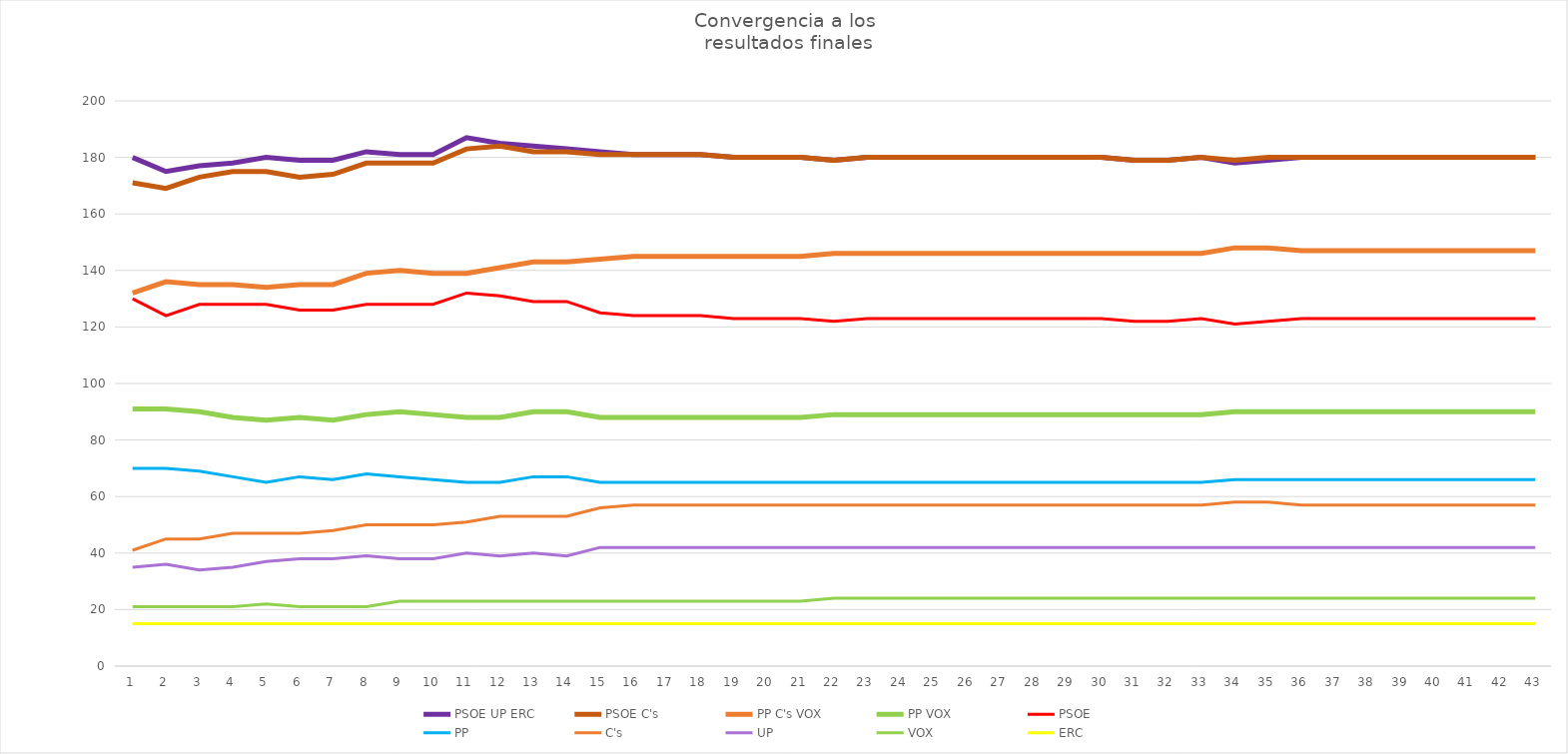
| Category | PSOE | PP | C's | UP | VOX | ERC |
|---|---|---|---|---|---|---|
| 0 | 130 | 70 | 41 | 35 | 21 | 15 |
| 1 | 124 | 70 | 45 | 36 | 21 | 15 |
| 2 | 128 | 69 | 45 | 34 | 21 | 15 |
| 3 | 128 | 67 | 47 | 35 | 21 | 15 |
| 4 | 128 | 65 | 47 | 37 | 22 | 15 |
| 5 | 126 | 67 | 47 | 38 | 21 | 15 |
| 6 | 126 | 66 | 48 | 38 | 21 | 15 |
| 7 | 128 | 68 | 50 | 39 | 21 | 15 |
| 8 | 128 | 67 | 50 | 38 | 23 | 15 |
| 9 | 128 | 66 | 50 | 38 | 23 | 15 |
| 10 | 132 | 65 | 51 | 40 | 23 | 15 |
| 11 | 131 | 65 | 53 | 39 | 23 | 15 |
| 12 | 129 | 67 | 53 | 40 | 23 | 15 |
| 13 | 129 | 67 | 53 | 39 | 23 | 15 |
| 14 | 125 | 65 | 56 | 42 | 23 | 15 |
| 15 | 124 | 65 | 57 | 42 | 23 | 15 |
| 16 | 124 | 65 | 57 | 42 | 23 | 15 |
| 17 | 124 | 65 | 57 | 42 | 23 | 15 |
| 18 | 123 | 65 | 57 | 42 | 23 | 15 |
| 19 | 123 | 65 | 57 | 42 | 23 | 15 |
| 20 | 123 | 65 | 57 | 42 | 23 | 15 |
| 21 | 122 | 65 | 57 | 42 | 24 | 15 |
| 22 | 123 | 65 | 57 | 42 | 24 | 15 |
| 23 | 123 | 65 | 57 | 42 | 24 | 15 |
| 24 | 123 | 65 | 57 | 42 | 24 | 15 |
| 25 | 123 | 65 | 57 | 42 | 24 | 15 |
| 26 | 123 | 65 | 57 | 42 | 24 | 15 |
| 27 | 123 | 65 | 57 | 42 | 24 | 15 |
| 28 | 123 | 65 | 57 | 42 | 24 | 15 |
| 29 | 123 | 65 | 57 | 42 | 24 | 15 |
| 30 | 122 | 65 | 57 | 42 | 24 | 15 |
| 31 | 122 | 65 | 57 | 42 | 24 | 15 |
| 32 | 123 | 65 | 57 | 42 | 24 | 15 |
| 33 | 121 | 66 | 58 | 42 | 24 | 15 |
| 34 | 122 | 66 | 58 | 42 | 24 | 15 |
| 35 | 123 | 66 | 57 | 42 | 24 | 15 |
| 36 | 123 | 66 | 57 | 42 | 24 | 15 |
| 37 | 123 | 66 | 57 | 42 | 24 | 15 |
| 38 | 123 | 66 | 57 | 42 | 24 | 15 |
| 39 | 123 | 66 | 57 | 42 | 24 | 15 |
| 40 | 123 | 66 | 57 | 42 | 24 | 15 |
| 41 | 123 | 66 | 57 | 42 | 24 | 15 |
| 42 | 123 | 66 | 57 | 42 | 24 | 15 |